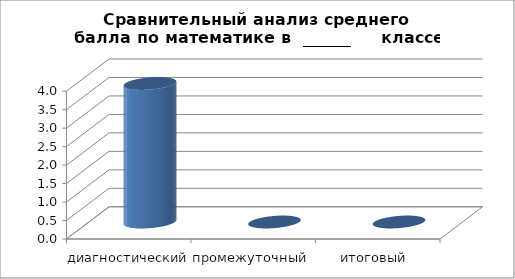
| Category | Series 0 |
|---|---|
| диагностический | 3.75 |
| промежуточный  | 0 |
| итоговый  | 0 |